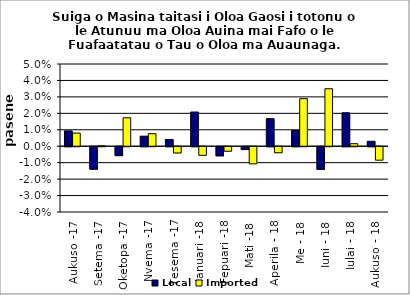
| Category | Local | Imported |
|---|---|---|
| Aukuso -17 | 0.009 | 0.008 |
| Setema -17 | -0.014 | 0 |
| Oketopa -17 | -0.005 | 0.017 |
| Nvema -17 | 0.006 | 0.008 |
| Tesema -17 | 0.004 | -0.004 |
| Ianuari -18 | 0.021 | -0.005 |
| Fepuari -18 | -0.006 | -0.003 |
| Mati -18 | -0.002 | -0.01 |
| Aperila - 18 | 0.017 | -0.004 |
| Me - 18 | 0.01 | 0.029 |
| Iuni - 18 | -0.014 | 0.035 |
| Iulai - 18 | 0.02 | 0.002 |
| Aukuso - 18 | 0.003 | -0.008 |